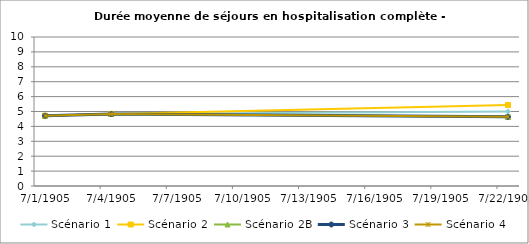
| Category | Scénario 1 | Scénario 2 | Scénario 2B | Scénario 3 | Scénario 4 |
|---|---|---|---|---|---|
| 2009.0 | 4.717 | 4.717 | 4.717 | 4.717 | 4.717 |
| 2012.0 | 4.833 | 4.833 | 4.833 | 4.833 | 4.833 |
| 2030.0 | 4.997 | 5.434 | 4.642 | 4.642 | 4.642 |